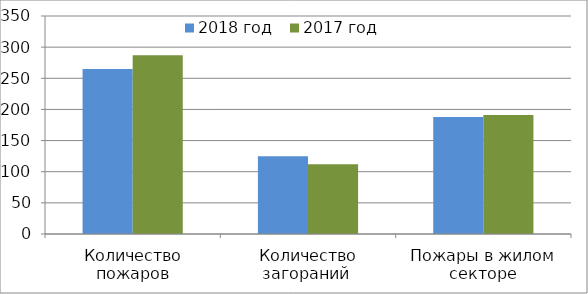
| Category | 2018 год | 2017 год |
|---|---|---|
| Количество пожаров | 265 | 287 |
| Количество загораний  | 125 | 112 |
| Пожары в жилом секторе | 188 | 191 |